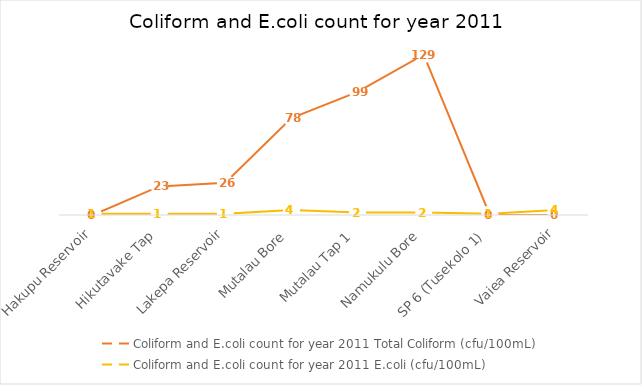
| Category | Coliform and E.coli count for year 2011 |
|---|---|
| Hakupu Reservoir | 1 |
| Hikutavake Tap | 1 |
| Lakepa Reservoir | 1 |
| Mutalau Bore | 4 |
| Mutalau Tap 1 | 2 |
| Namukulu Bore | 2 |
| SP 6 (Tusekolo 1) | 1 |
| Vaiea Reservoir | 4 |